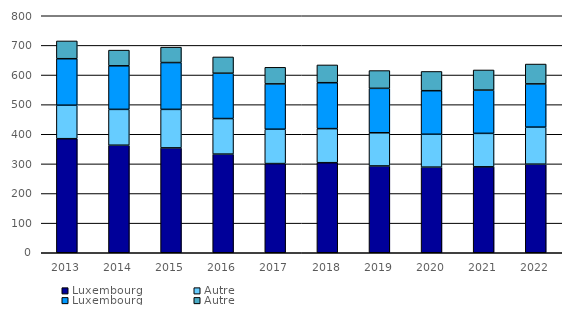
| Category | Luxembourg | Autre |
|---|---|---|
| 2013.0 | 157 | 60 |
| 2014.0 | 147 | 53 |
| 2015.0 | 158 | 52 |
| 2016.0 | 153 | 55 |
| 2017.0 | 153 | 56 |
| 2018.0 | 155 | 60 |
| 2019.0 | 150 | 60 |
| 2020.0 | 147 | 65 |
| 2021.0 | 146 | 68 |
| 2022.0 | 146 | 67 |